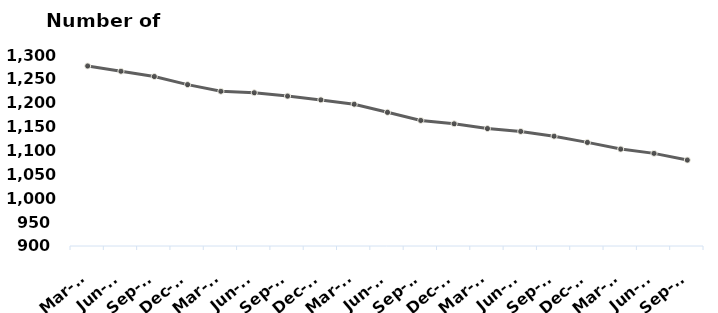
| Category | Total |
|---|---|
| Mar-15 | 1277 |
| Jun-15 | 1266 |
| Sep-15 | 1255 |
| Dec-15 | 1238 |
| Mar-16 | 1224 |
| Jun-16 | 1221 |
| Sep-16 | 1214 |
| Dec-16 | 1206 |
| Mar-17 | 1197 |
| Jun-17 | 1180 |
| Sep-17 | 1163 |
| Dec-17 | 1156 |
| Mar-18 | 1146 |
| Jun-18 | 1140 |
| Sep-18 | 1130 |
| Dec-18 | 1117 |
| Mar-19 | 1103 |
| Jun-19 | 1094 |
| Sep-19 | 1080 |